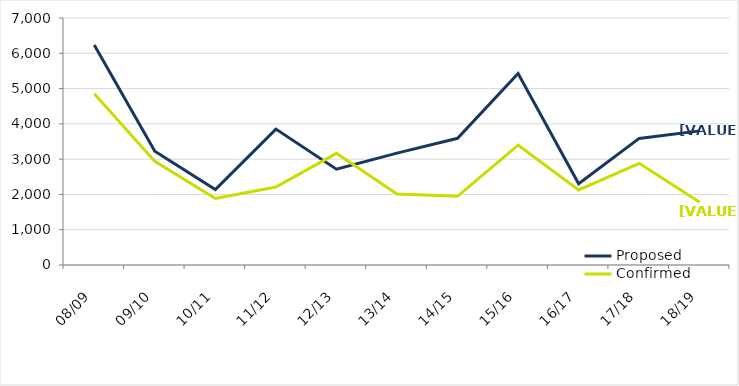
| Category | Proposed | Confirmed |
|---|---|---|
| 08/09 | 6236 | 4851 |
| 09/10 | 3223 | 2936 |
| 10/11 | 2140 | 1887 |
| 11/12 | 3851 | 2208 |
| 12/13 | 2716 | 3165 |
| 13/14 | 3170 | 2013 |
| 14/15 | 3590 | 1947 |
| 15/16 | 5427 | 3397 |
| 16/17 | 2302 | 2127 |
| 17/18 | 3588 | 2881 |
| 18/19 | 3801 | 1777 |